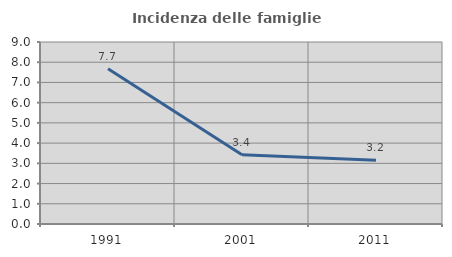
| Category | Incidenza delle famiglie numerose |
|---|---|
| 1991.0 | 7.68 |
| 2001.0 | 3.425 |
| 2011.0 | 3.158 |